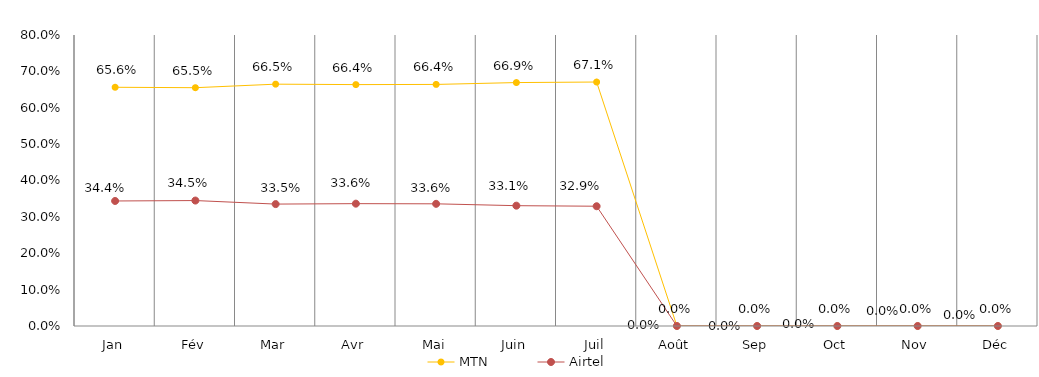
| Category | MTN | Airtel |
|---|---|---|
| Jan | 0.656 | 0.344 |
| Fév | 0.655 | 0.345 |
| Mar | 0.665 | 0.335 |
| Avr | 0.664 | 0.336 |
| Mai | 0.664 | 0.336 |
| Juin | 0.669 | 0.331 |
| Juil | 0.671 | 0.329 |
| Août | 0 | 0 |
| Sep | 0 | 0 |
| Oct | 0 | 0 |
| Nov | 0 | 0 |
| Déc | 0 | 0 |